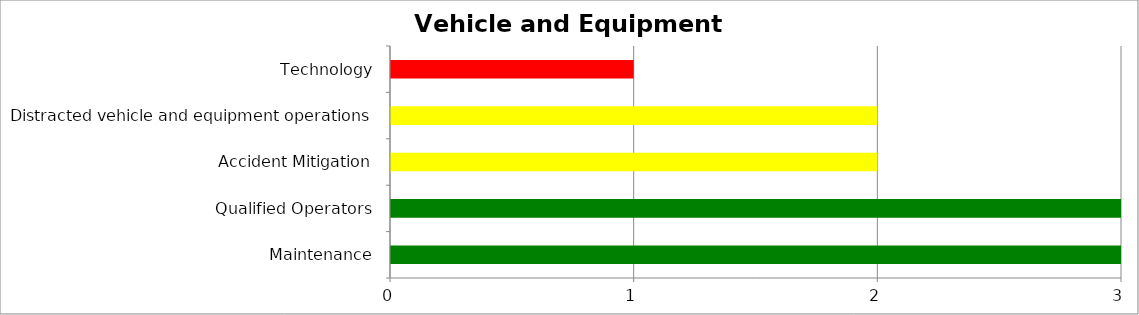
| Category | Low | Medium | High |
|---|---|---|---|
| Maintenance | 3 | 0 | 0 |
| Qualified Operators | 3 | 0 | 0 |
| Accident Mitigation | 0 | 2 | 0 |
| Distracted vehicle and equipment operations | 0 | 2 | 0 |
| Technology | 0 | 0 | 1 |